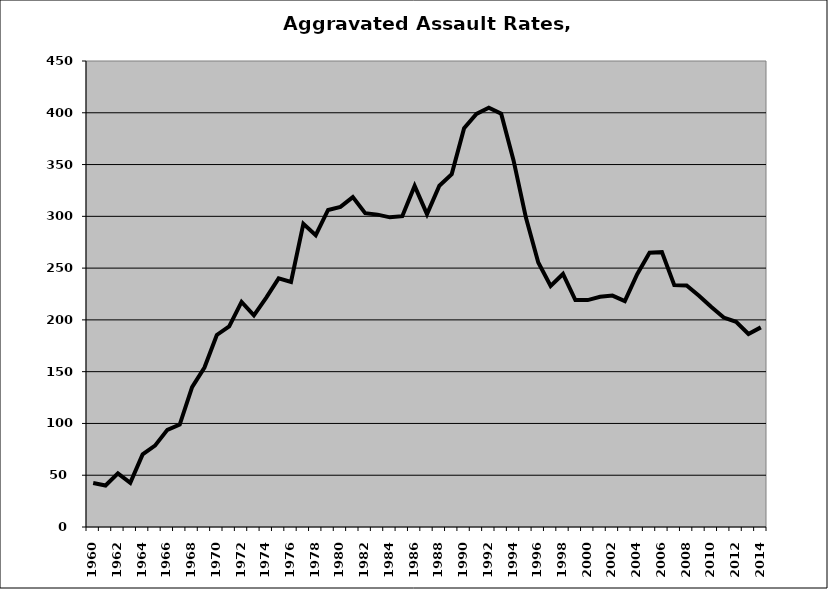
| Category | Aggravated Assault |
|---|---|
| 1960.0 | 42.419 |
| 1961.0 | 40.034 |
| 1962.0 | 51.757 |
| 1963.0 | 42.631 |
| 1964.0 | 70.092 |
| 1965.0 | 78.568 |
| 1966.0 | 93.778 |
| 1967.0 | 98.937 |
| 1968.0 | 135.01 |
| 1969.0 | 154 |
| 1970.0 | 185.434 |
| 1971.0 | 193.78 |
| 1972.0 | 217.31 |
| 1973.0 | 204.391 |
| 1974.0 | 221.554 |
| 1975.0 | 240.095 |
| 1976.0 | 236.663 |
| 1977.0 | 292.86 |
| 1978.0 | 281.873 |
| 1979.0 | 306.133 |
| 1980.0 | 309.164 |
| 1981.0 | 318.529 |
| 1982.0 | 303.087 |
| 1983.0 | 301.657 |
| 1984.0 | 299.025 |
| 1985.0 | 300.124 |
| 1986.0 | 329.415 |
| 1987.0 | 302.124 |
| 1988.0 | 329.544 |
| 1989.0 | 340.79 |
| 1990.0 | 385.018 |
| 1991.0 | 398.934 |
| 1992.0 | 404.87 |
| 1993.0 | 399.047 |
| 1994.0 | 354.048 |
| 1995.0 | 298.746 |
| 1996.0 | 255.375 |
| 1997.0 | 232.802 |
| 1998.0 | 244.372 |
| 1999.0 | 219.199 |
| 2000.0 | 219.122 |
| 2001.0 | 222.275 |
| 2002.0 | 223.459 |
| 2003.0 | 218.157 |
| 2004.0 | 244.164 |
| 2005.0 | 264.856 |
| 2006.0 | 265.432 |
| 2007.0 | 233.59 |
| 2008.0 | 233.222 |
| 2009.0 | 223.354 |
| 2010.0 | 212.42 |
| 2011.0 | 202.216 |
| 2012.0 | 198.19 |
| 2013.0 | 186.378 |
| 2014.0 | 192.779 |